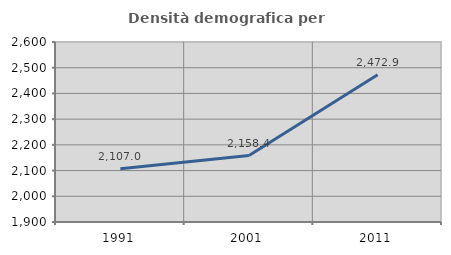
| Category | Densità demografica |
|---|---|
| 1991.0 | 2106.957 |
| 2001.0 | 2158.443 |
| 2011.0 | 2472.878 |